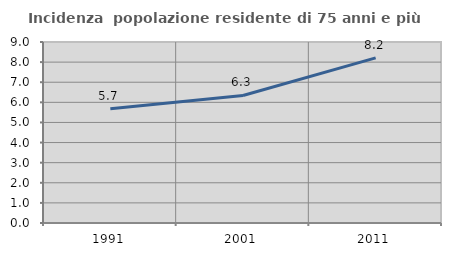
| Category | Incidenza  popolazione residente di 75 anni e più |
|---|---|
| 1991.0 | 5.682 |
| 2001.0 | 6.342 |
| 2011.0 | 8.213 |